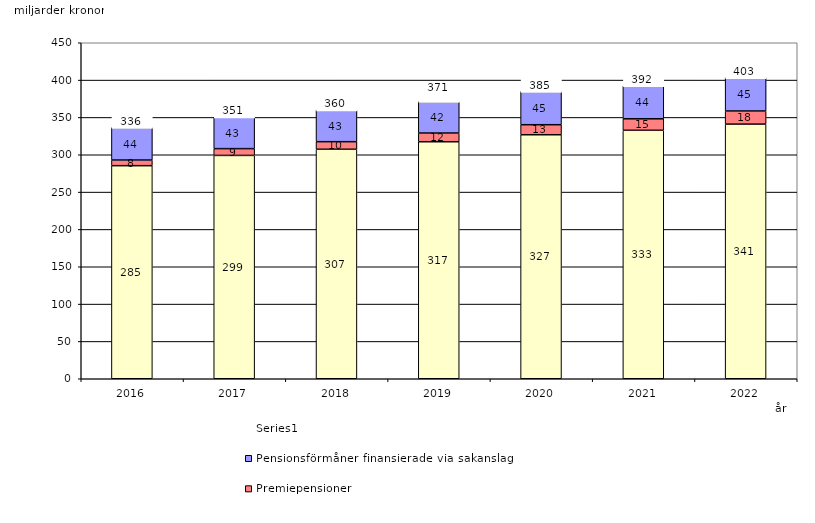
| Category | Inkomstpension och tilläggspension m.m. | Premiepensioner | Pensionsförmåner finansierade via sakanslag | Series 0 |
|---|---|---|---|---|
| 2016.0 | 285.357 | 7.598 | 43.541 | 20 |
| 2017.0 | 299.103 | 9.081 | 42.508 | 20 |
| 2018.0 | 307.355 | 10.141 | 42.538 | 20 |
| 2019.0 | 317.414 | 11.682 | 42.119 | 20 |
| 2020.0 | 326.787 | 13.45 | 44.577 | 20 |
| 2021.0 | 332.771 | 15.388 | 44.102 | 20 |
| 2022.0 | 341.036 | 17.595 | 44.643 | 20 |